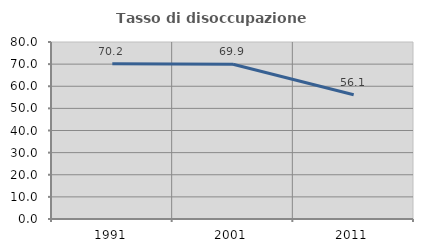
| Category | Tasso di disoccupazione giovanile  |
|---|---|
| 1991.0 | 70.201 |
| 2001.0 | 69.939 |
| 2011.0 | 56.132 |